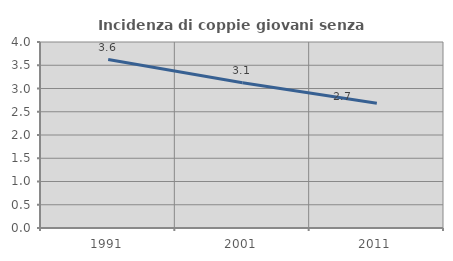
| Category | Incidenza di coppie giovani senza figli |
|---|---|
| 1991.0 | 3.622 |
| 2001.0 | 3.122 |
| 2011.0 | 2.683 |